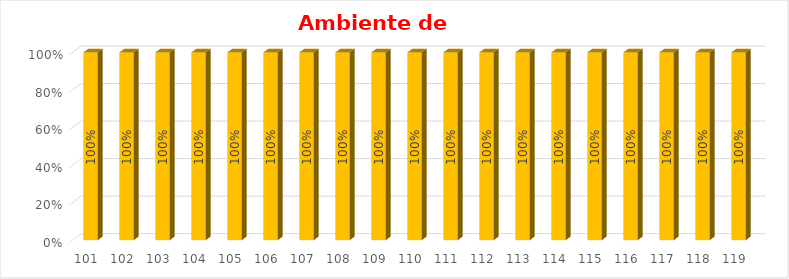
| Category | % Avance |
|---|---|
| 101.0 | 1 |
| 102.0 | 1 |
| 103.0 | 1 |
| 104.0 | 1 |
| 105.0 | 1 |
| 106.0 | 1 |
| 107.0 | 1 |
| 108.0 | 1 |
| 109.0 | 1 |
| 110.0 | 1 |
| 111.0 | 1 |
| 112.0 | 1 |
| 113.0 | 1 |
| 114.0 | 1 |
| 115.0 | 1 |
| 116.0 | 1 |
| 117.0 | 1 |
| 118.0 | 1 |
| 119.0 | 1 |